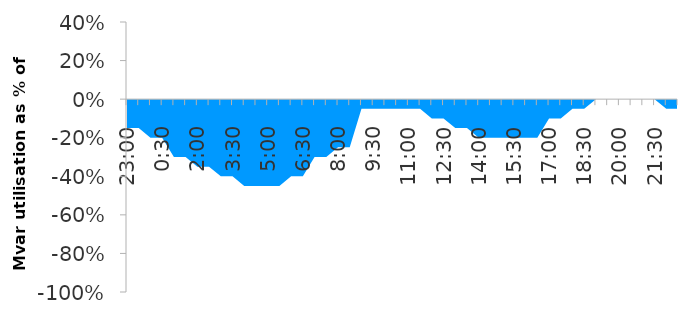
| Category | Series 0 |
|---|---|
| 0.9583333333333334 | -0.15 |
| 0.9791666666666666 | -0.15 |
| 0.0 | -0.2 |
| 0.020833333333333332 | -0.2 |
| 0.041666666666666664 | -0.3 |
| 0.0625 | -0.3 |
| 0.08333333333333333 | -0.35 |
| 0.10416666666666667 | -0.35 |
| 0.125 | -0.4 |
| 0.14583333333333334 | -0.4 |
| 0.16666666666666666 | -0.45 |
| 0.1875 | -0.45 |
| 0.20833333333333334 | -0.45 |
| 0.22916666666666666 | -0.45 |
| 0.25 | -0.4 |
| 0.2708333333333333 | -0.4 |
| 0.2916666666666667 | -0.3 |
| 0.3125 | -0.3 |
| 0.3333333333333333 | -0.25 |
| 0.3541666666666667 | -0.25 |
| 0.375 | -0.05 |
| 0.3958333333333333 | -0.05 |
| 0.4166666666666667 | -0.05 |
| 0.4375 | -0.05 |
| 0.4583333333333333 | -0.05 |
| 0.4791666666666667 | -0.05 |
| 0.5 | -0.1 |
| 0.5208333333333334 | -0.1 |
| 0.5416666666666666 | -0.15 |
| 0.5625 | -0.15 |
| 0.5833333333333334 | -0.2 |
| 0.6041666666666666 | -0.2 |
| 0.625 | -0.2 |
| 0.6458333333333334 | -0.2 |
| 0.6666666666666666 | -0.2 |
| 0.6875 | -0.2 |
| 0.7083333333333334 | -0.1 |
| 0.7291666666666666 | -0.1 |
| 0.75 | -0.05 |
| 0.7708333333333334 | -0.05 |
| 0.7916666666666666 | 0 |
| 0.8125 | 0 |
| 0.8333333333333334 | 0 |
| 0.8541666666666666 | 0 |
| 0.875 | 0 |
| 0.8958333333333334 | 0 |
| 0.9166666666666666 | -0.05 |
| 0.9375 | -0.05 |